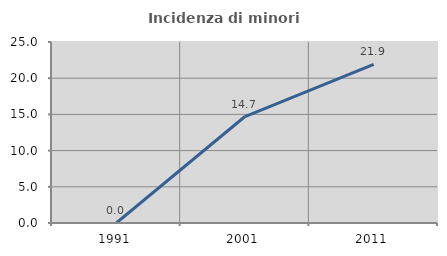
| Category | Incidenza di minori stranieri |
|---|---|
| 1991.0 | 0 |
| 2001.0 | 14.706 |
| 2011.0 | 21.918 |